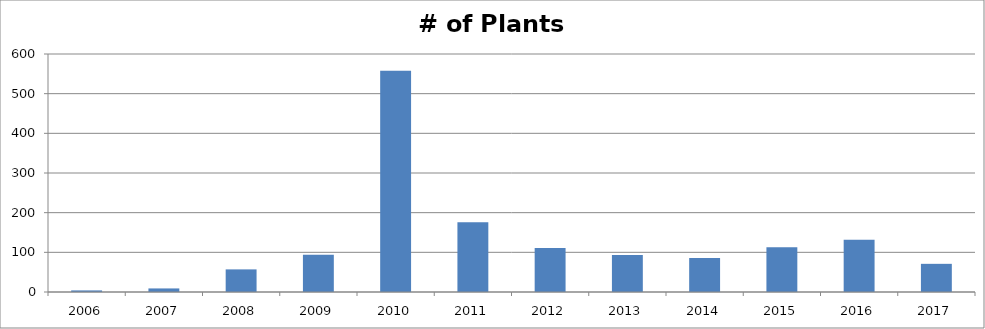
| Category | # of Plants Observed |
|---|---|
| 2006.0 | 4 |
| 2007.0 | 9 |
| 2008.0 | 57 |
| 2009.0 | 94 |
| 2010.0 | 558 |
| 2011.0 | 176 |
| 2012.0 | 111 |
| 2013.0 | 93 |
| 2014.0 | 86 |
| 2015.0 | 113 |
| 2016.0 | 132 |
| 2017.0 | 71 |